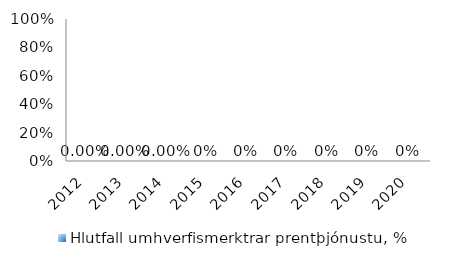
| Category | Hlutfall umhverfismerktrar prentþjónustu, % |
|---|---|
| 2012.0 | 0 |
| 2013.0 | 0 |
| 2014.0 | 0 |
| 2015.0 | 0 |
| 2016.0 | 0 |
| 2017.0 | 0 |
| 2018.0 | 0 |
| 2019.0 | 0 |
| 2020.0 | 0 |